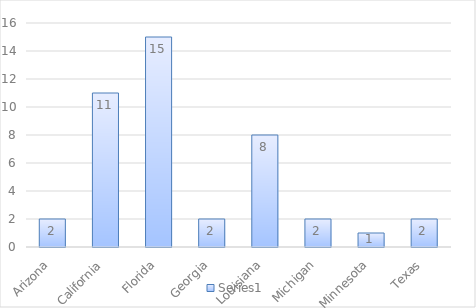
| Category | Series 0 |
|---|---|
| Arizona | 2 |
| California | 11 |
| Florida | 15 |
| Georgia | 2 |
| Louisiana | 8 |
| Michigan | 2 |
| Minnesota | 1 |
| Texas | 2 |